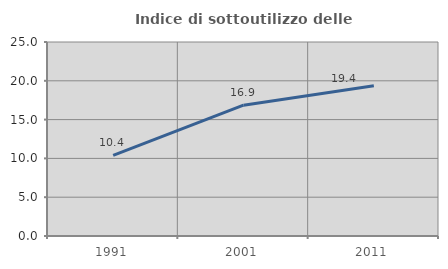
| Category | Indice di sottoutilizzo delle abitazioni  |
|---|---|
| 1991.0 | 10.378 |
| 2001.0 | 16.858 |
| 2011.0 | 19.352 |